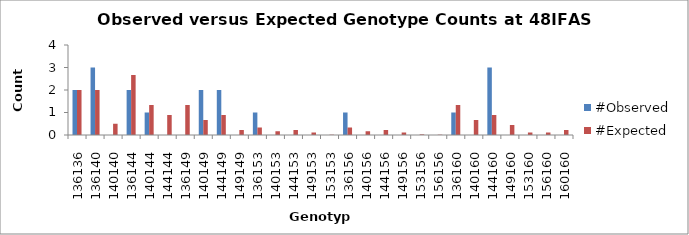
| Category | #Observed | #Expected |
|---|---|---|
| 136136.0 | 2 | 2 |
| 136140.0 | 3 | 2 |
| 140140.0 | 0 | 0.5 |
| 136144.0 | 2 | 2.667 |
| 140144.0 | 1 | 1.333 |
| 144144.0 | 0 | 0.889 |
| 136149.0 | 0 | 1.333 |
| 140149.0 | 2 | 0.667 |
| 144149.0 | 2 | 0.889 |
| 149149.0 | 0 | 0.222 |
| 136153.0 | 1 | 0.333 |
| 140153.0 | 0 | 0.167 |
| 144153.0 | 0 | 0.222 |
| 149153.0 | 0 | 0.111 |
| 153153.0 | 0 | 0.014 |
| 136156.0 | 1 | 0.333 |
| 140156.0 | 0 | 0.167 |
| 144156.0 | 0 | 0.222 |
| 149156.0 | 0 | 0.111 |
| 153156.0 | 0 | 0.028 |
| 156156.0 | 0 | 0.014 |
| 136160.0 | 1 | 1.333 |
| 140160.0 | 0 | 0.667 |
| 144160.0 | 3 | 0.889 |
| 149160.0 | 0 | 0.444 |
| 153160.0 | 0 | 0.111 |
| 156160.0 | 0 | 0.111 |
| 160160.0 | 0 | 0.222 |